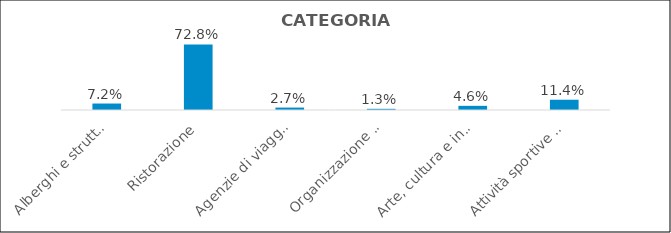
| Category | Series 0 |
|---|---|
| Alberghi e strutture ricettive | 0.072 |
| Ristorazione | 0.728 |
| Agenzie di viaggi e tour operator | 0.027 |
| Organizzazione di convegni e fiere | 0.013 |
| Arte, cultura e intrattenimento | 0.046 |
| Attività sportive e ricreative | 0.114 |